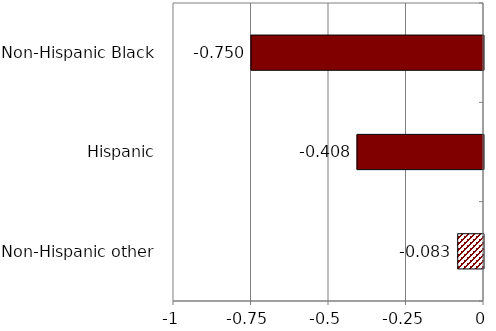
| Category | Series 0 |
|---|---|
| Non-Hispanic other | -0.083 |
| Hispanic | -0.408 |
| Non-Hispanic Black | -0.75 |